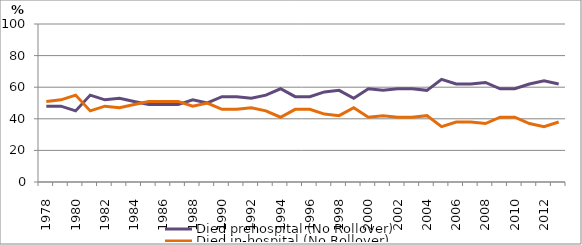
| Category | Died prehospital (No Rollover) | Died in-hospital (No Rollover) |
|---|---|---|
| 1978.0 | 48 | 51 |
| 1979.0 | 48 | 52 |
| 1980.0 | 45 | 55 |
| 1981.0 | 55 | 45 |
| 1982.0 | 52 | 48 |
| 1983.0 | 53 | 47 |
| 1984.0 | 51 | 49 |
| 1985.0 | 49 | 51 |
| 1986.0 | 49 | 51 |
| 1987.0 | 49 | 51 |
| 1988.0 | 52 | 48 |
| 1989.0 | 50 | 50 |
| 1990.0 | 54 | 46 |
| 1991.0 | 54 | 46 |
| 1992.0 | 53 | 47 |
| 1993.0 | 55 | 45 |
| 1994.0 | 59 | 41 |
| 1995.0 | 54 | 46 |
| 1996.0 | 54 | 46 |
| 1997.0 | 57 | 43 |
| 1998.0 | 58 | 42 |
| 1999.0 | 53 | 47 |
| 2000.0 | 59 | 41 |
| 2001.0 | 58 | 42 |
| 2002.0 | 59 | 41 |
| 2003.0 | 59 | 41 |
| 2004.0 | 58 | 42 |
| 2005.0 | 65 | 35 |
| 2006.0 | 62 | 38 |
| 2007.0 | 62 | 38 |
| 2008.0 | 63 | 37 |
| 2009.0 | 59 | 41 |
| 2010.0 | 59 | 41 |
| 2011.0 | 62 | 37 |
| 2012.0 | 64 | 35 |
| 2013.0 | 62 | 38 |